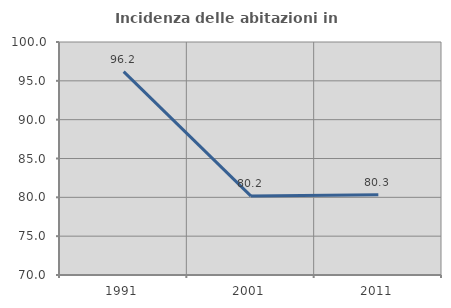
| Category | Incidenza delle abitazioni in proprietà  |
|---|---|
| 1991.0 | 96.178 |
| 2001.0 | 80.159 |
| 2011.0 | 80.328 |